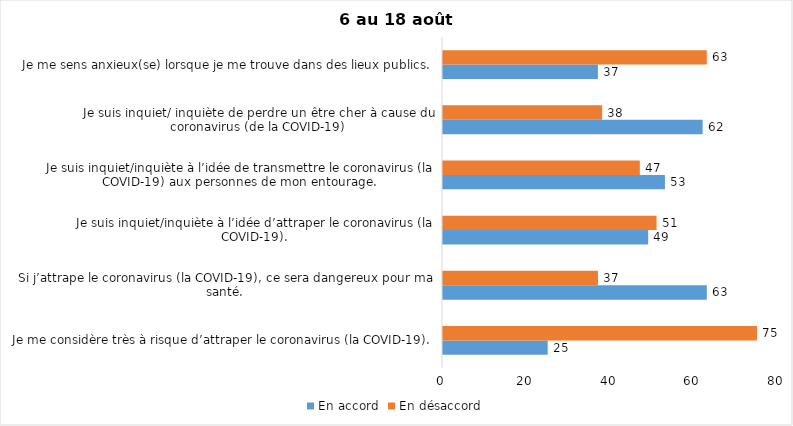
| Category | En accord | En désaccord |
|---|---|---|
| Je me considère très à risque d’attraper le coronavirus (la COVID-19). | 25 | 75 |
| Si j’attrape le coronavirus (la COVID-19), ce sera dangereux pour ma santé. | 63 | 37 |
| Je suis inquiet/inquiète à l’idée d’attraper le coronavirus (la COVID-19). | 49 | 51 |
| Je suis inquiet/inquiète à l’idée de transmettre le coronavirus (la COVID-19) aux personnes de mon entourage. | 53 | 47 |
| Je suis inquiet/ inquiète de perdre un être cher à cause du coronavirus (de la COVID-19) | 62 | 38 |
| Je me sens anxieux(se) lorsque je me trouve dans des lieux publics. | 37 | 63 |